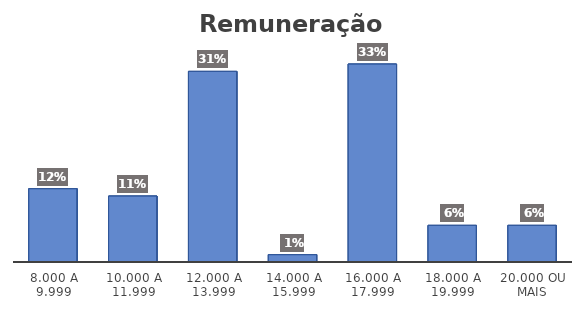
| Category | Series 0 |
|---|---|
| 8.000 a 9.999 | 0.12 |
| 10.000 a 11.999 | 0.108 |
| 12.000 a 13.999 | 0.313 |
| 14.000 a 15.999 | 0.012 |
| 16.000 a 17.999 | 0.325 |
| 18.000 a 19.999 | 0.06 |
| 20.000 ou mais | 0.06 |